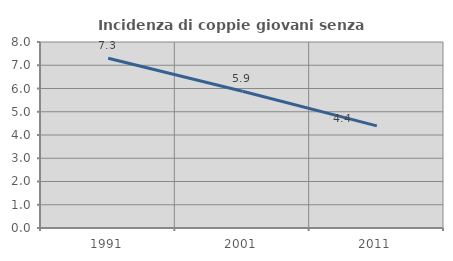
| Category | Incidenza di coppie giovani senza figli |
|---|---|
| 1991.0 | 7.303 |
| 2001.0 | 5.88 |
| 2011.0 | 4.392 |